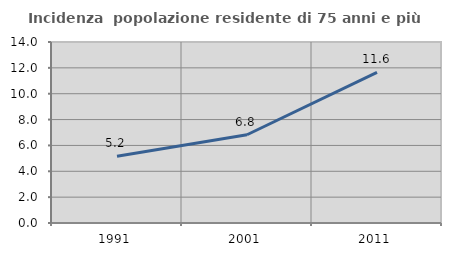
| Category | Incidenza  popolazione residente di 75 anni e più |
|---|---|
| 1991.0 | 5.169 |
| 2001.0 | 6.827 |
| 2011.0 | 11.648 |